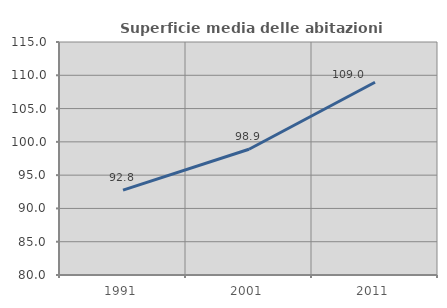
| Category | Superficie media delle abitazioni occupate |
|---|---|
| 1991.0 | 92.759 |
| 2001.0 | 98.884 |
| 2011.0 | 108.953 |